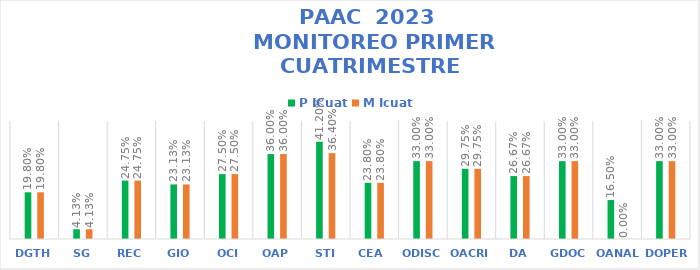
| Category | P ICuat | M Icuat |
|---|---|---|
| DGTH | 0.198 | 0.198 |
| SG | 0.041 | 0.041 |
| REC | 0.248 | 0.248 |
| GIO | 0.231 | 0.231 |
| OCI | 0.275 | 0.275 |
| OAP | 0.36 | 0.36 |
| STI | 0.412 | 0.364 |
| CEA  | 0.238 | 0.238 |
| ODISC | 0.33 | 0.33 |
| OACRI | 0.298 | 0.298 |
| DA | 0.267 | 0.267 |
| GDOC | 0.33 | 0.33 |
| OANAL | 0.165 | 0 |
| DOPER | 0.33 | 0.33 |